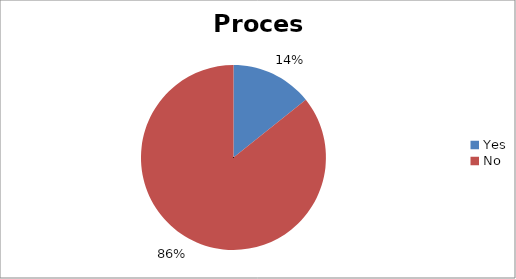
| Category | Process |
|---|---|
| Yes | 2 |
| No | 12 |